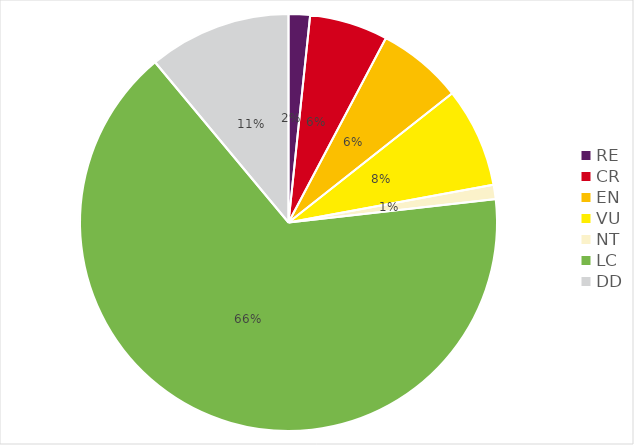
| Category | RE |
|---|---|
| RE | 0.017 |
| CR | 0.061 |
| EN | 0.066 |
| VU | 0.077 |
| NT | 0.011 |
| LC | 0.657 |
| DD | 0.11 |